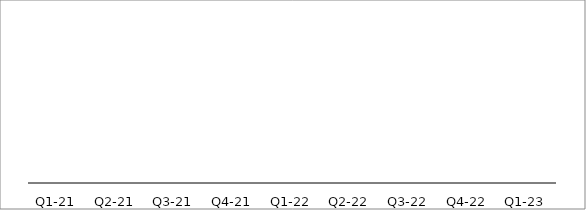
| Category | Total Assets Value |
|---|---|
| 0 | 0 |
| 1 | 0 |
| 2 | 0 |
| 3 | 0 |
| 4 | 0 |
| 5 | 0 |
| 6 | 0 |
| 7 | 0 |
| 8 | 0 |